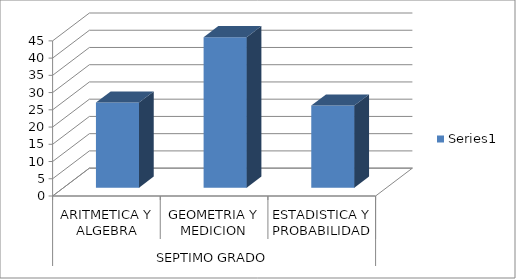
| Category | Series 0 |
|---|---|
| 0 | 24.67 |
| 1 | 43.64 |
| 2 | 23.8 |